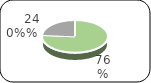
| Category | Series 0 |
|---|---|
| 0 | 12202.7 |
| 1 | 0 |
| 2 | 3772.3 |